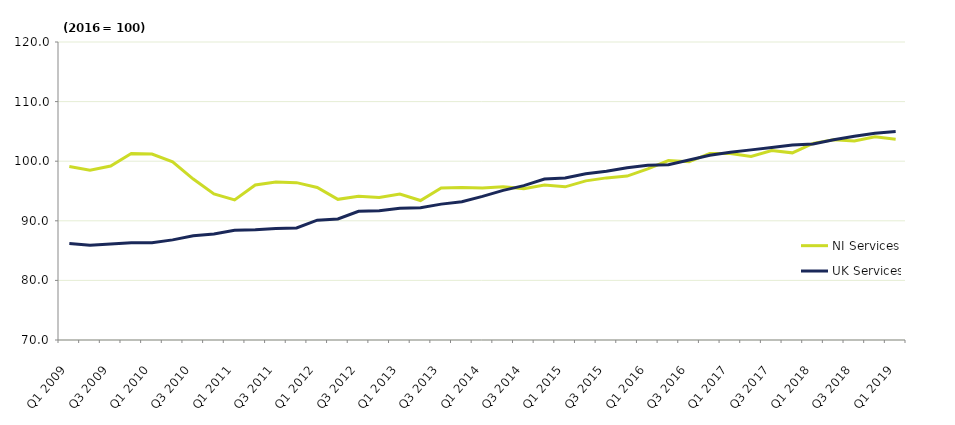
| Category | NI Services | UK Services |
|---|---|---|
| Q1 2009 | 99.1 | 86.2 |
| Q2 2009 | 98.5 | 85.9 |
| Q3 2009 | 99.2 | 86.1 |
| Q4 2009 | 101.3 | 86.3 |
| Q1 2010 | 101.2 | 86.3 |
| Q2 2010 | 99.9 | 86.8 |
| Q3 2010 | 97 | 87.5 |
| Q4 2010 | 94.5 | 87.8 |
| Q1 2011 | 93.5 | 88.4 |
| Q2 2011 | 96 | 88.5 |
| Q3 2011 | 96.5 | 88.7 |
| Q4 2011 | 96.4 | 88.8 |
| Q1 2012 | 95.6 | 90.1 |
| Q2 2012 | 93.6 | 90.3 |
| Q3 2012 | 94.1 | 91.6 |
| Q4 2012 | 93.9 | 91.7 |
| Q1 2013 | 94.5 | 92.1 |
| Q2 2013 | 93.4 | 92.2 |
| Q3 2013 | 95.5 | 92.8 |
| Q4 2013 | 95.6 | 93.2 |
| Q1 2014 | 95.5 | 94.1 |
| Q2 2014 | 95.7 | 95.1 |
| Q3 2014 | 95.4 | 95.9 |
| Q4 2014 | 96 | 97 |
| Q1 2015 | 95.7 | 97.2 |
| Q2 2015 | 96.7 | 97.9 |
| Q3 2015 | 97.2 | 98.3 |
| Q4 2015 | 97.5 | 98.9 |
| Q1 2016 | 98.7 | 99.3 |
| Q2 2016 | 100.1 | 99.4 |
| Q3 2016 | 99.9 | 100.2 |
| Q4 2016 | 101.3 | 101 |
| Q1 2017 | 101.3 | 101.5 |
| Q2 2017 | 100.8 | 101.9 |
| Q3 2017 | 101.8 | 102.3 |
| Q4 2017 | 101.4 | 102.7 |
| Q1 2018 | 103 | 102.9 |
| Q2 2018 | 103.6 | 103.6 |
| Q3 2018 | 103.4 | 104.2 |
| Q4 2018 | 104.1 | 104.7 |
| Q1 2019 | 103.7 | 105 |